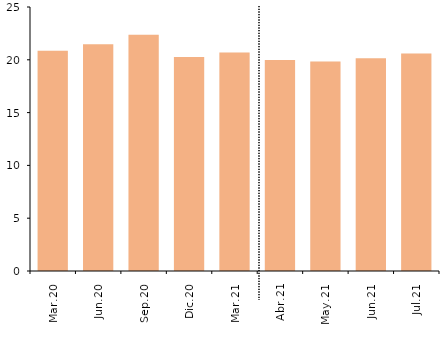
| Category | #¡REF! | RDI>6 y RCI>40%(*) |
|---|---|---|
| Mar.20 |  | 20.852 |
| Jun.20 |  | 21.473 |
| Sep.20 |  | 22.374 |
| Dic.20 |  | 20.261 |
| Mar.21 |  | 20.684 |
| Abr.21 |  | 19.98 |
| May.21 |  | 19.832 |
| Jun.21 |  | 20.15 |
| Jul.21 |  | 20.596 |